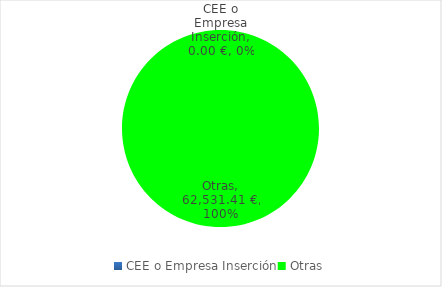
| Category | Suma de TOTAL |
|---|---|
| CEE o Empresa Inserción | 0 |
| Otras | 62531.41 |